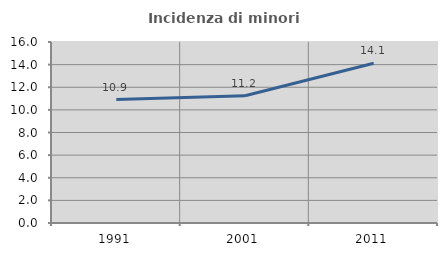
| Category | Incidenza di minori stranieri |
|---|---|
| 1991.0 | 10.909 |
| 2001.0 | 11.245 |
| 2011.0 | 14.118 |